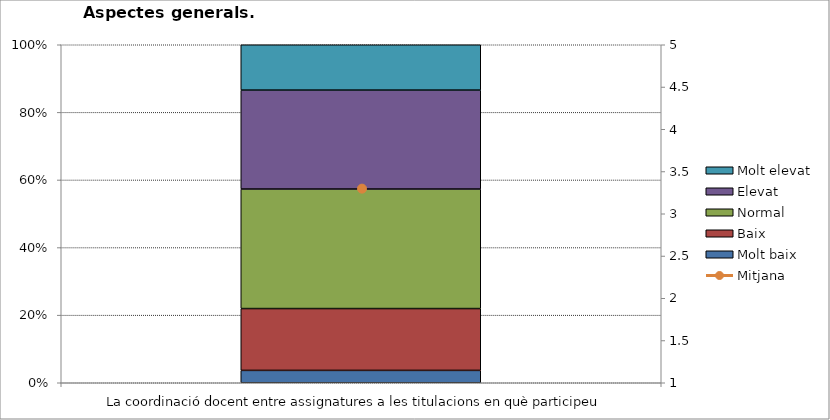
| Category | Molt baix | Baix | Normal  | Elevat | Molt elevat |
|---|---|---|---|---|---|
| La coordinació docent entre assignatures a les titulacions en què participeu | 3 | 15 | 29 | 24 | 11 |